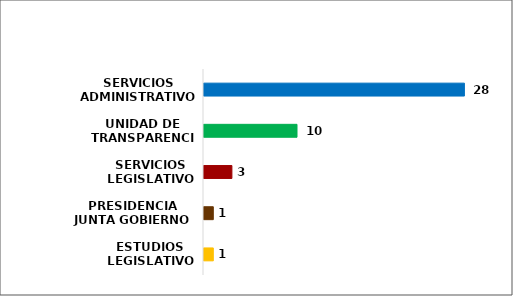
| Category | Series 0 |
|---|---|
| ESTUDIOS LEGISLATIVOS | 1 |
| PRESIDENCIA JUNTA GOBIERNO | 1 |
| SERVICIOS LEGISLATIVOS | 3 |
| UNIDAD DE TRANSPARENCIA | 10 |
| SERVICIOS ADMINISTRATIVOS | 28 |